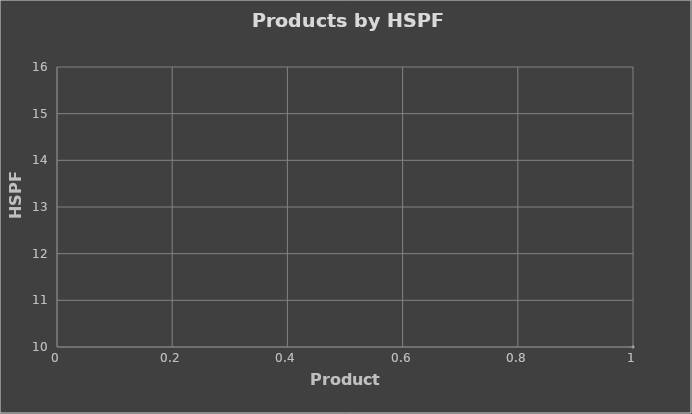
| Category | Series 0 |
|---|---|
| 0 | 10 |
| 1 | 10 |
| 2 | 10 |
| 3 | 10 |
| 4 | 10 |
| 5 | 10 |
| 6 | 10 |
| 7 | 10 |
| 8 | 10 |
| 9 | 10 |
| 10 | 10 |
| 11 | 10 |
| 12 | 10 |
| 13 | 10 |
| 14 | 10 |
| 15 | 10 |
| 16 | 10 |
| 17 | 10 |
| 18 | 10 |
| 19 | 10 |
| 20 | 10 |
| 21 | 10 |
| 22 | 10 |
| 23 | 10 |
| 24 | 10 |
| 25 | 15 |
| 26 | 14 |
| 27 | 12 |
| 28 | 12 |
| 29 | 10.5 |
| 30 | 10 |
| 31 | 10 |
| 32 | 10 |
| 33 | 10 |
| 34 | 12 |
| 35 | 10.5 |
| 36 | 10.5 |
| 37 | 13 |
| 38 | 10.5 |
| 39 | 10.5 |
| 40 | 11.5 |
| 41 | 12 |
| 42 | 11 |
| 43 | 12 |
| 44 | 10.3 |
| 45 | 10.3 |
| 46 | 10.2 |
| 47 | 10.2 |
| 48 | 10 |
| 49 | 10 |
| 50 | 10 |
| 51 | 10.5 |
| 52 | 10.5 |
| 53 | 12 |
| 54 | 10.5 |
| 55 | 10.5 |
| 56 | 13 |
| 57 | 10.5 |
| 58 | 10.5 |
| 59 | 11.5 |
| 60 | 12 |
| 61 | 11 |
| 62 | 12 |
| 63 | 12 |
| 64 | 13 |
| 65 | 12.5 |
| 66 | 13 |
| 67 | 10.5 |
| 68 | 10.5 |
| 69 | 10.3 |
| 70 | 12 |
| 71 | 11.2 |
| 72 | 10.5 |
| 73 | 10.5 |
| 74 | 11 |
| 75 | 12.5 |
| 76 | 10 |
| 77 | 10.3 |
| 78 | 10.3 |
| 79 | 10.3 |
| 80 | 11.2 |
| 81 | 12 |
| 82 | 10.3 |
| 83 | 10.5 |
| 84 | 10.7 |
| 85 | 12.5 |
| 86 | 10.3 |
| 87 | 12.5 |
| 88 | 10 |
| 89 | 10 |
| 90 | 10 |
| 91 | 10 |
| 92 | 11 |
| 93 | 10.55 |
| 94 | 10 |
| 95 | 12.5 |
| 96 | 12.5 |
| 97 | 11.6 |
| 98 | 11 |
| 99 | 10.6 |
| 100 | 12.5 |
| 101 | 11.3 |
| 102 | 12 |
| 103 | 11.7 |
| 104 | 12.5 |
| 105 | 11.7 |
| 106 | 11.2 |
| 107 | 11 |
| 108 | 10.1 |
| 109 | 10.5 |
| 110 | 10.1 |
| 111 | 10 |
| 112 | 11.2 |
| 113 | 12 |
| 114 | 11.5 |
| 115 | 10.6 |
| 116 | 10.2 |
| 117 | 11 |
| 118 | 11 |
| 119 | 11 |
| 120 | 11 |
| 121 | 10.3 |
| 122 | 10.3 |
| 123 | 10.3 |
| 124 | 11.4 |
| 125 | 11.4 |
| 126 | 12.5 |
| 127 | 12 |
| 128 | 13 |
| 129 | 12.2 |
| 130 | 12.2 |
| 131 | 11.5 |
| 132 | 12.6 |
| 133 | 11.6 |
| 134 | 11.2 |
| 135 | 12.4 |
| 136 | 11.3 |
| 137 | 11 |
| 138 | 14 |
| 139 | 13.4 |
| 140 | 13.8 |
| 141 | 13.3 |
| 142 | 14.2 |
| 143 | 14 |
| 144 | 14.2 |
| 145 | 14 |
| 146 | 14 |
| 147 | 13.8 |
| 148 | 13.4 |
| 149 | 13.3 |
| 150 | 10.5 |
| 151 | 10.4 |
| 152 | 10.5 |
| 153 | 11.8 |
| 154 | 11 |
| 155 | 11 |
| 156 | 10.6 |
| 157 | 10.6 |
| 158 | 10 |
| 159 | 10.5 |
| 160 | 10.5 |
| 161 | 10.3 |
| 162 | 10.3 |
| 163 | 10.2 |
| 164 | 10.4 |
| 165 | 10.5 |
| 166 | 10 |
| 167 | 10 |
| 168 | 10 |
| 169 | 10 |
| 170 | 11.5 |
| 171 | 12 |
| 172 | 11.2 |
| 173 | 11.2 |
| 174 | 12 |
| 175 | 11.5 |
| 176 | 10 |
| 177 | 10 |
| 178 | 10 |
| 179 | 10.5 |
| 180 | 10 |
| 181 | 10 |
| 182 | 10 |
| 183 | 10 |
| 184 | 10 |
| 185 | 10 |
| 186 | 11.2 |
| 187 | 13 |
| 188 | 10.8 |
| 189 | 10.8 |
| 190 | 11 |
| 191 | 11 |
| 192 | 10.4 |
| 193 | 10.4 |
| 194 | 11.5 |
| 195 | 11.5 |
| 196 | 10.5 |
| 197 | 11 |
| 198 | 11 |
| 199 | 10.5 |
| 200 | 10.5 |
| 201 | 10.5 |
| 202 | 10.5 |
| 203 | 10.3 |
| 204 | 10.3 |
| 205 | 10.5 |
| 206 | 10.5 |
| 207 | 10.5 |
| 208 | 10.5 |
| 209 | 10.3 |
| 210 | 11.2 |
| 211 | 10.8 |
| 212 | 12 |
| 213 | 11 |
| 214 | 10.4 |
| 215 | 11.5 |
| 216 | 11.5 |
| 217 | 10.5 |
| 218 | 10 |
| 219 | 10 |
| 220 | 10 |
| 221 | 10.5 |
| 222 | 11 |
| 223 | 15 |
| 224 | 14 |
| 225 | 12 |
| 226 | 12 |
| 227 | 11 |
| 228 | 11.5 |
| 229 | 11.5 |
| 230 | 15 |
| 231 | 12 |
| 232 | 12 |
| 233 | 14 |
| 234 | 11 |
| 235 | 11.5 |
| 236 | 11.5 |
| 237 | 10.5 |
| 238 | 10.5 |
| 239 | 10.5 |
| 240 | 12 |
| 241 | 12 |
| 242 | 15 |
| 243 | 14 |
| 244 | 10 |
| 245 | 10 |
| 246 | 11 |
| 247 | 11 |
| 248 | 10 |
| 249 | 12 |
| 250 | 13 |
| 251 | 12 |
| 252 | 10 |
| 253 | 10.3 |
| 254 | 10.3 |
| 255 | 10.3 |
| 256 | 10.3 |
| 257 | 10.3 |
| 258 | 10.3 |
| 259 | 10.3 |
| 260 | 10.3 |
| 261 | 10.3 |
| 262 | 10.3 |
| 263 | 10.3 |
| 264 | 10.3 |
| 265 | 10.3 |
| 266 | 10.3 |
| 267 | 10.3 |
| 268 | 10.3 |
| 269 | 10.3 |
| 270 | 10.3 |
| 271 | 10.3 |
| 272 | 10.3 |
| 273 | 10.3 |
| 274 | 10 |
| 275 | 10 |
| 276 | 10.4 |
| 277 | 10.5 |
| 278 | 10.5 |
| 279 | 10 |
| 280 | 10 |
| 281 | 10.5 |
| 282 | 10 |
| 283 | 10 |
| 284 | 10 |
| 285 | 11.5 |
| 286 | 12.5 |
| 287 | 12 |
| 288 | 10.6 |
| 289 | 10 |
| 290 | 10.2 |
| 291 | 10 |
| 292 | 10 |
| 293 | 10.1 |
| 294 | 10.2 |
| 295 | 11 |
| 296 | 10.8 |
| 297 | 10.8 |
| 298 | 11 |
| 299 | 11 |
| 300 | 12 |
| 301 | 12 |
| 302 | 12 |
| 303 | 12.5 |
| 304 | 11 |
| 305 | 10 |
| 306 | 10.7 |
| 307 | 11 |
| 308 | 10.5 |
| 309 | 11.5 |
| 310 | 11.5 |
| 311 | 10.5 |
| 312 | 10.75 |
| 313 | 0 |
| 314 | 0 |
| 315 | 11 |
| 316 | 11.3 |
| 317 | 10.7 |
| 318 | 10 |
| 319 | 11.5 |
| 320 | 11.7 |
| 321 | 11.4 |
| 322 | 11 |
| 323 | 10.5 |
| 324 | 11 |
| 325 | 10 |
| 326 | 10.5 |
| 327 | 11 |
| 328 | 10 |
| 329 | 10 |
| 330 | 10 |
| 331 | 11 |
| 332 | 10.4 |
| 333 | 10 |
| 334 | 10 |
| 335 | 10 |
| 336 | 10.5 |
| 337 | 13.5 |
| 338 | 12.5 |
| 339 | 12 |
| 340 | 11.5 |
| 341 | 12.5 |
| 342 | 11 |
| 343 | 10 |
| 344 | 10.1 |
| 345 | 12.8 |
| 346 | 12.5 |
| 347 | 11.7 |
| 348 | 11.2 |
| 349 | 11.2 |
| 350 | 10.4 |
| 351 | 11 |
| 352 | 11.6 |
| 353 | 13.5 |
| 354 | 12.5 |
| 355 | 12 |
| 356 | 12 |
| 357 | 13 |
| 358 | 11.3 |
| 359 | 10.3 |
| 360 | 10 |
| 361 | 10 |
| 362 | 10 |
| 363 | 10 |
| 364 | 10.5 |
| 365 | 11 |
| 366 | 11 |
| 367 | 10 |
| 368 | 14 |
| 369 | 12.5 |
| 370 | 10 |
| 371 | 10 |
| 372 | 12 |
| 373 | 11 |
| 374 | 10 |
| 375 | 10 |
| 376 | 10.5 |
| 377 | 10.1 |
| 378 | 10.4 |
| 379 | 10.5 |
| 380 | 10.1 |
| 381 | 10.4 |
| 382 | 12 |
| 383 | 11.5 |
| 384 | 10.7 |
| 385 | 10.5 |
| 386 | 10 |
| 387 | 10 |
| 388 | 10 |
| 389 | 10 |
| 390 | 10 |
| 391 | 10 |
| 392 | 10 |
| 393 | 10 |
| 394 | 10 |
| 395 | 10 |
| 396 | 10 |
| 397 | 10 |
| 398 | 10 |
| 399 | 10 |
| 400 | 10 |
| 401 | 10 |
| 402 | 10 |
| 403 | 10 |
| 404 | 10 |
| 405 | 10 |
| 406 | 10 |
| 407 | 10 |
| 408 | 10 |
| 409 | 10 |
| 410 | 10 |
| 411 | 10 |
| 412 | 10 |
| 413 | 10 |
| 414 | 10 |
| 415 | 10 |
| 416 | 10 |
| 417 | 10 |
| 418 | 10 |
| 419 | 10 |